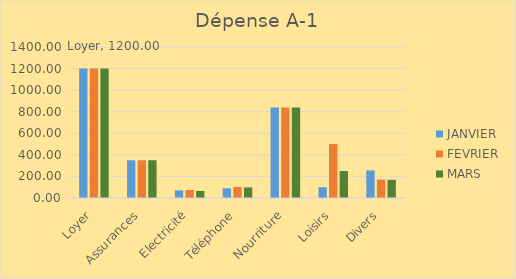
| Category | JANVIER | FEVRIER | MARS |
|---|---|---|---|
| Loyer | 1200 | 1200 | 1200 |
| Assurances | 350 | 350 | 350 |
| Electricité | 70.65 | 75 | 65.5 |
| Téléphone | 89.9 | 102.45 | 98 |
| Nourriture | 840 | 840 | 840 |
| Loisirs | 100 | 500 | 250 |
| Divers | 255.8 | 170.35 | 168.65 |